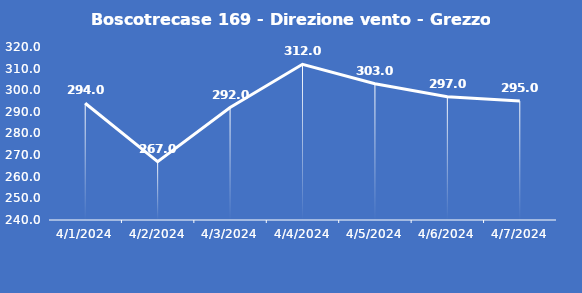
| Category | Boscotrecase 169 - Direzione vento - Grezzo (°N) |
|---|---|
| 4/1/24 | 294 |
| 4/2/24 | 267 |
| 4/3/24 | 292 |
| 4/4/24 | 312 |
| 4/5/24 | 303 |
| 4/6/24 | 297 |
| 4/7/24 | 295 |